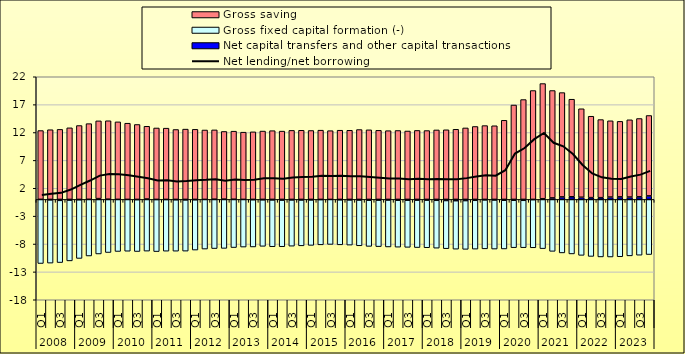
| Category | Net capital transfers and other capital transactions | Gross fixed capital formation (-) | Gross saving |
|---|---|---|---|
| 0 | 0.01 | -11.5 | 12.34 |
| 1 | -0.08 | -11.35 | 12.5 |
| 2 | -0.17 | -11.16 | 12.56 |
| 3 | -0.12 | -10.91 | 12.84 |
| 4 | -0.06 | -10.53 | 13.25 |
| 5 | 0.02 | -10.15 | 13.57 |
| 6 | 0.14 | -9.79 | 13.95 |
| 7 | 0.04 | -9.53 | 14.07 |
| 8 | 0.01 | -9.34 | 13.9 |
| 9 | 0 | -9.3 | 13.67 |
| 10 | -0.04 | -9.31 | 13.44 |
| 11 | 0.07 | -9.28 | 13.05 |
| 12 | -0.02 | -9.34 | 12.81 |
| 13 | -0.02 | -9.27 | 12.78 |
| 14 | -0.06 | -9.23 | 12.54 |
| 15 | -0.09 | -9.19 | 12.61 |
| 16 | -0.06 | -9.03 | 12.57 |
| 17 | 0 | -8.91 | 12.45 |
| 18 | 0.04 | -8.82 | 12.43 |
| 19 | 0.05 | -8.79 | 12.14 |
| 20 | 0.03 | -8.64 | 12.21 |
| 21 | 0 | -8.55 | 12.06 |
| 22 | -0.05 | -8.48 | 12.12 |
| 23 | -0.07 | -8.35 | 12.26 |
| 24 | -0.09 | -8.4 | 12.33 |
| 25 | -0.12 | -8.37 | 12.25 |
| 26 | -0.09 | -8.3 | 12.38 |
| 27 | -0.1 | -8.23 | 12.4 |
| 28 | -0.09 | -8.16 | 12.36 |
| 29 | -0.03 | -8.12 | 12.42 |
| 30 | 0 | -8.08 | 12.33 |
| 31 | -0.07 | -8.08 | 12.41 |
| 32 | -0.09 | -8.11 | 12.4 |
| 33 | -0.11 | -8.21 | 12.53 |
| 34 | -0.14 | -8.29 | 12.48 |
| 35 | -0.13 | -8.34 | 12.39 |
| 36 | -0.11 | -8.42 | 12.33 |
| 37 | -0.14 | -8.43 | 12.36 |
| 38 | -0.14 | -8.46 | 12.27 |
| 39 | -0.13 | -8.51 | 12.37 |
| 40 | -0.13 | -8.54 | 12.35 |
| 41 | -0.16 | -8.59 | 12.46 |
| 42 | -0.2 | -8.64 | 12.49 |
| 43 | -0.23 | -8.7 | 12.58 |
| 44 | -0.21 | -8.75 | 12.82 |
| 45 | -0.16 | -8.76 | 13.08 |
| 46 | -0.09 | -8.78 | 13.24 |
| 47 | -0.11 | -8.8 | 13.21 |
| 48 | -0.15 | -8.74 | 14.19 |
| 49 | -0.15 | -8.51 | 16.93 |
| 50 | -0.16 | -8.5 | 17.91 |
| 51 | -0.04 | -8.64 | 19.53 |
| 52 | 0.12 | -8.83 | 20.66 |
| 53 | 0.27 | -9.32 | 19.26 |
| 54 | 0.45 | -9.6 | 18.71 |
| 55 | 0.47 | -9.78 | 17.5 |
| 56 | 0.39 | -10.04 | 15.87 |
| 57 | 0.32 | -10.23 | 14.6 |
| 58 | 0.31 | -10.32 | 14.01 |
| 59 | 0.42 | -10.33 | 13.68 |
| 60 | 0.45 | -10.29 | 13.55 |
| 61 | 0.42 | -10.13 | 13.86 |
| 62 | 0.46 | -10.01 | 14.05 |
| 63 | 0.63 | -9.89 | 14.42 |